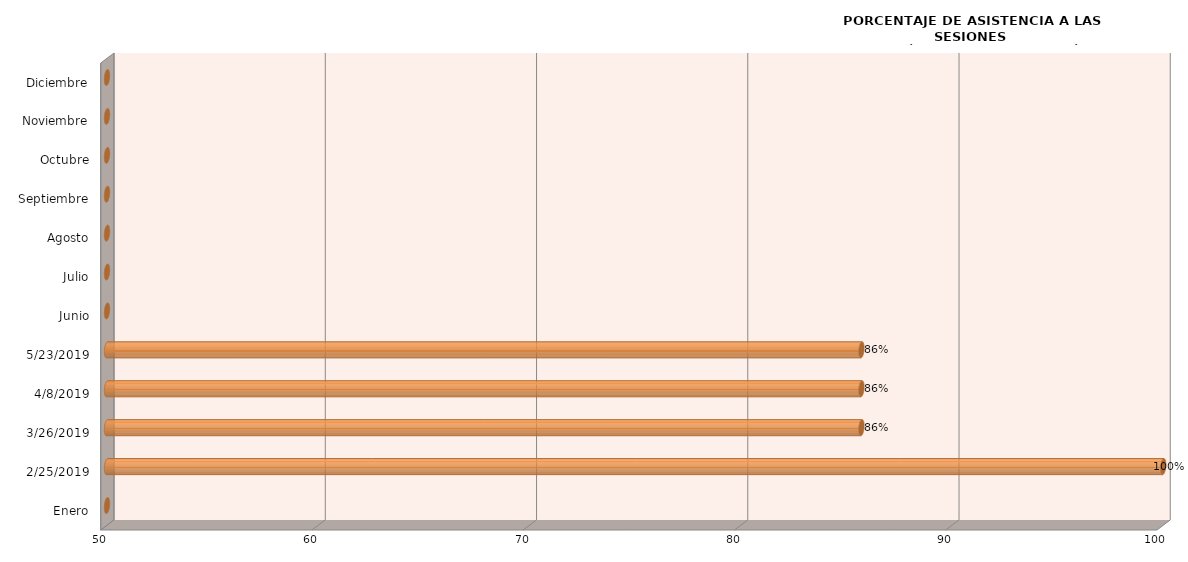
| Category | Series 0 |
|---|---|
| Enero | 0 |
| 25/02/2019 | 100 |
| 26/03/2019 | 85.714 |
| 08/04/2019 | 85.714 |
| 23/05/2019 | 85.714 |
| Junio | 0 |
| Julio | 0 |
| Agosto | 0 |
| Septiembre | 0 |
| Octubre | 0 |
| Noviembre | 0 |
| Diciembre | 0 |